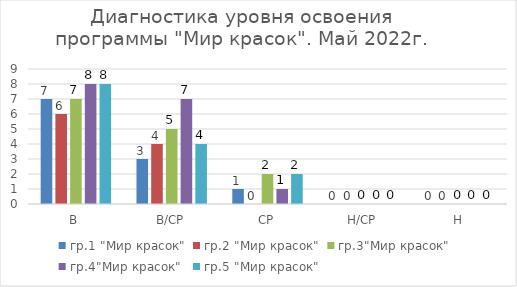
| Category | гр.1 "Мир красок" | гр.2 "Мир красок" | гр.3"Мир красок" | гр.4"Мир красок" | гр.5 "Мир красок" |
|---|---|---|---|---|---|
| В | 7 | 6 | 7 | 8 | 8 |
| В/СР | 3 | 4 | 5 | 7 | 4 |
| СР | 1 | 0 | 2 | 1 | 2 |
| Н/СР | 0 | 0 | 0 | 0 | 0 |
| Н | 0 | 0 | 0 | 0 | 0 |